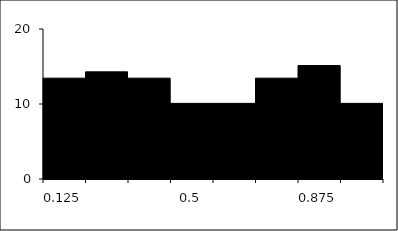
| Category | Series 1 |
|---|---|
| 0.125 | 13.445 |
| 0.25 | 14.286 |
| 0.375 | 13.445 |
| 0.5 | 10.084 |
| 0.625 | 10.084 |
| 0.75 | 13.445 |
| 0.875 | 15.126 |
| 1.0 | 10.084 |